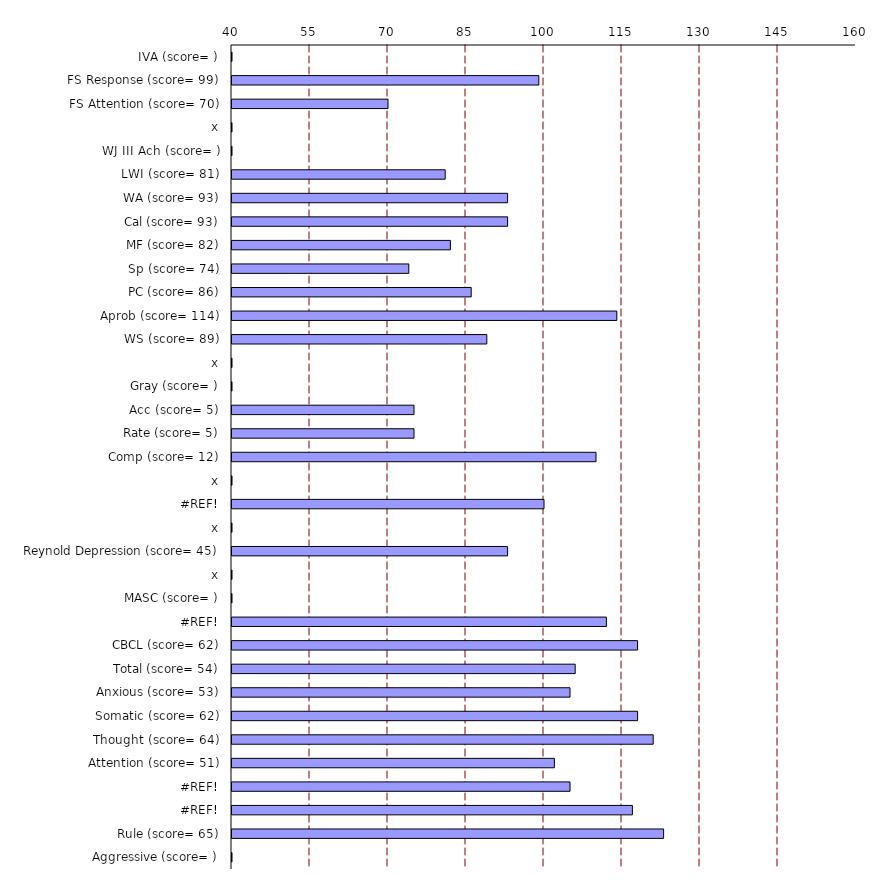
| Category | Series 0 |
|---|---|
| IVA (score= ) | 0 |
| FS Response (score= 99) | 99 |
| FS Attention (score= 70) | 70 |
| x | 0 |
| WJ III Ach (score= ) | 0 |
| LWI (score= 81) | 81 |
| WA (score= 93) | 93 |
| Cal (score= 93) | 93 |
| MF (score= 82) | 82 |
| Sp (score= 74) | 74 |
| PC (score= 86) | 86 |
| Aprob (score= 114) | 114 |
| WS (score= 89) | 89 |
| x | 0 |
| Gray (score= ) | 0 |
| Acc (score= 5) | 75 |
| Rate (score= 5) | 75 |
| Comp (score= 12) | 110 |
| x | 0 |
| #REF! | 100 |
| x | 0 |
| Reynold Depression (score= 45) | 93 |
| x | 0 |
| MASC (score= ) | 0 |
| #REF! | 112 |
| CBCL (score= 62) | 118 |
| Total (score= 54) | 106 |
| Anxious (score= 53) | 105 |
| Somatic (score= 62) | 118 |
| Thought (score= 64) | 121 |
| Attention (score= 51) | 102 |
| #REF! | 105 |
| #REF! | 117 |
| Rule (score= 65) | 123 |
| Aggressive (score= ) | 0 |